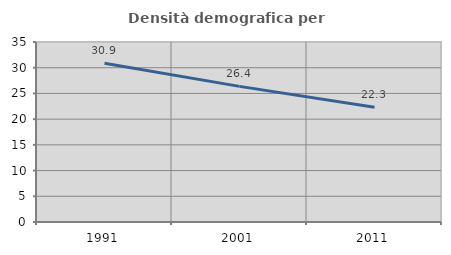
| Category | Densità demografica |
|---|---|
| 1991.0 | 30.885 |
| 2001.0 | 26.372 |
| 2011.0 | 22.329 |